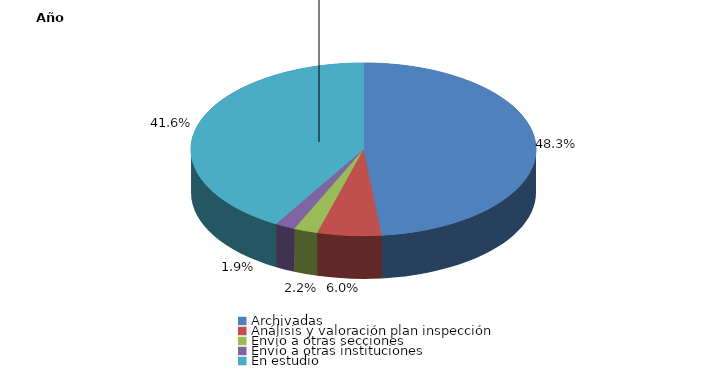
| Category | Series 0 |
|---|---|
| Archivadas | 129 |
| Análisis y valoración plan inspección | 16 |
| Envío a otras secciones | 6 |
| Envío a otras instituciones | 5 |
| En estudio | 111 |